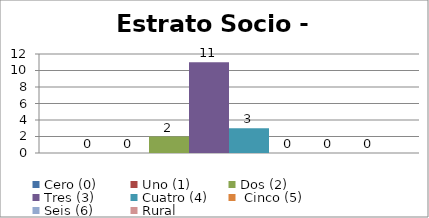
| Category | Cero (0) | Uno (1)   | Dos (2) | Tres (3) | Cuatro (4) |  Cinco (5) | Seis (6) | Rural |
|---|---|---|---|---|---|---|---|---|
| 0 |  |  | 2 | 11 | 3 | 0 | 0 |  |